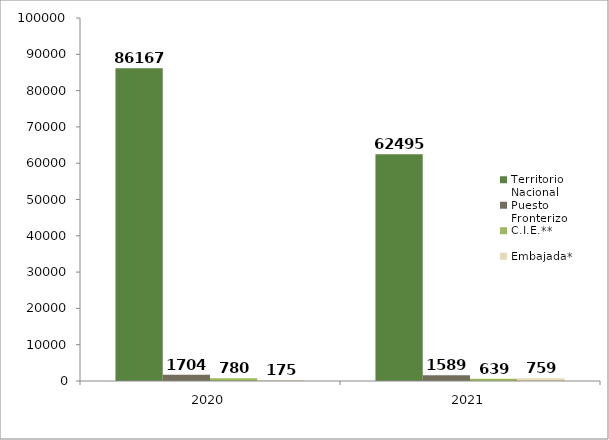
| Category | Territorio Nacional  | Puesto Fronterizo | C.I.E.** | Embajada* |
|---|---|---|---|---|
| 2020.0 | 86167 | 1704 | 780 | 175 |
| 2021.0 | 62495 | 1589 | 639 | 759 |